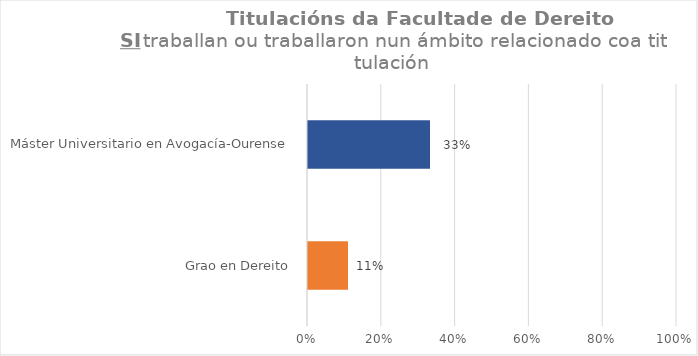
| Category | Series 0 |
|---|---|
| Grao en Dereito | 0.111 |
| Máster Universitario en Avogacía-Ourense | 0.333 |